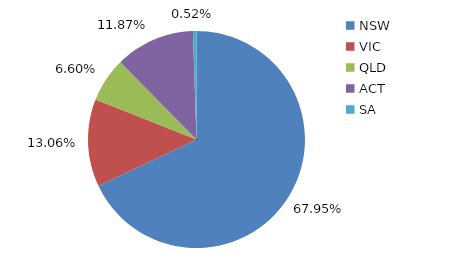
| Category | Series 0 |
|---|---|
| NSW | 0.679 |
| VIC | 0.131 |
| QLD | 0.066 |
| ACT | 0.119 |
| SA | 0.005 |